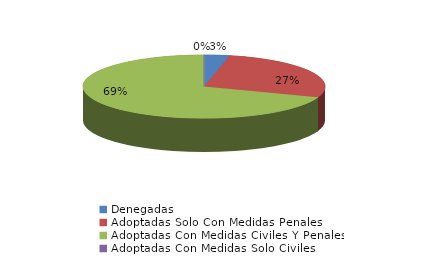
| Category | Series 0 |
|---|---|
| Denegadas | 4 |
| Adoptadas Solo Con Medidas Penales | 32 |
| Adoptadas Con Medidas Civiles Y Penales | 82 |
| Adoptadas Con Medidas Solo Civiles | 0 |